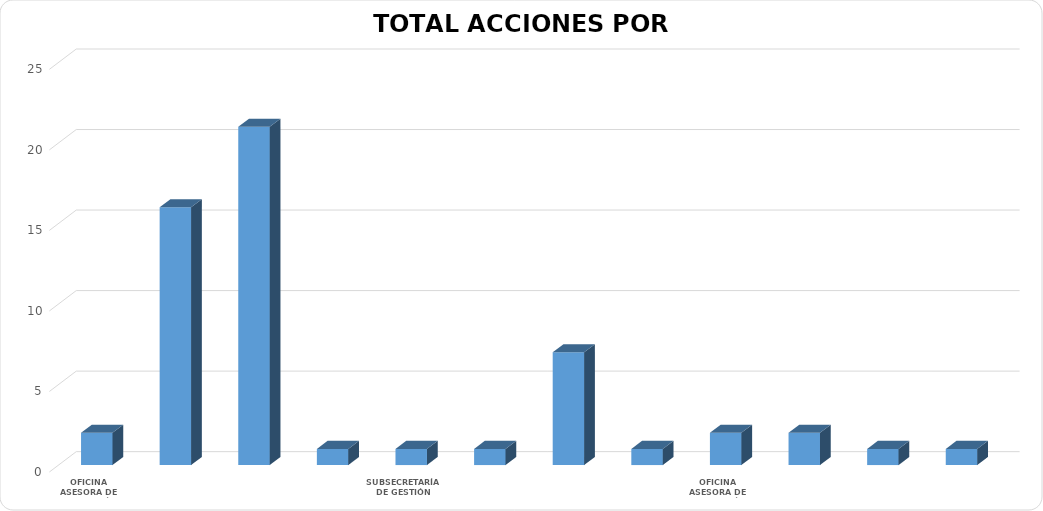
| Category | ABIERTA |
|---|---|
| OFICINA ASESORA DE PLANEACIÓN INSTITUCIONAL | 2 |
| SUBSECRETARÍA DE GESTIÓN CORPORATIVA  | 16 |
| SUBSECRETARÍA DE GESTIÓN DE LA MOVILIDAD | 21 |
| SUBSECRETARÍA DE GESTIÓN JURIDICA | 1 |
| SUBSECRETARÍA DE GESTIÓN JURIDICA - OTIC | 1 |
| SUBSECRETARÍA DE POLÍTICA DE MOVILIDAD | 1 |
| SUBSECRETARÍA DE SERVICIOS A LA CIUDADANÍA | 7 |
| SUBSECRETARÍA DE SERVICIOS A LA CIUDADANÍA - SUBSECRETARÍA DE GESTIÓN CORPORATIVA  | 1 |
| OFICINA ASESORA DE PLANEACIÓN INSTITUCIONAL - SUBSECRETARÍAS DE LA ENTIDAD. | 2 |
| SUBSECRETARÍA DE GESTIÓN JURÍDICA - SUBSECRETARÍA DE GESTIÓN CORPORATIVA | 2 |
| ORDENADORES DEL GASTO | 1 |
| ORDENADORES DEL GASTO - SUBSECRETARÍA DE GESTIÓN JURIDICA | 1 |